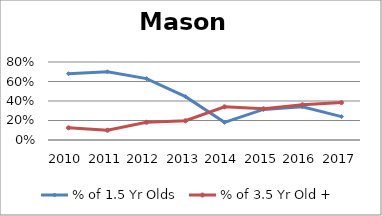
| Category | % of 1.5 Yr Olds | % of 3.5 Yr Old + |
|---|---|---|
| 2010.0 | 0.68 | 0.125 |
| 2011.0 | 0.7 | 0.1 |
| 2012.0 | 0.629 | 0.182 |
| 2013.0 | 0.444 | 0.198 |
| 2014.0 | 0.181 | 0.34 |
| 2015.0 | 0.313 | 0.32 |
| 2016.0 | 0.34 | 0.361 |
| 2017.0 | 0.24 | 0.384 |